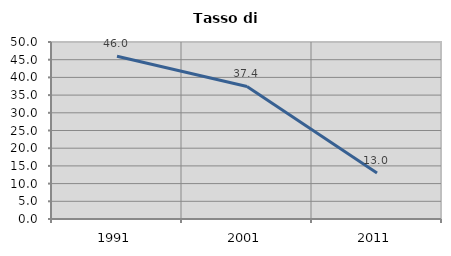
| Category | Tasso di disoccupazione   |
|---|---|
| 1991.0 | 45.968 |
| 2001.0 | 37.445 |
| 2011.0 | 13.025 |